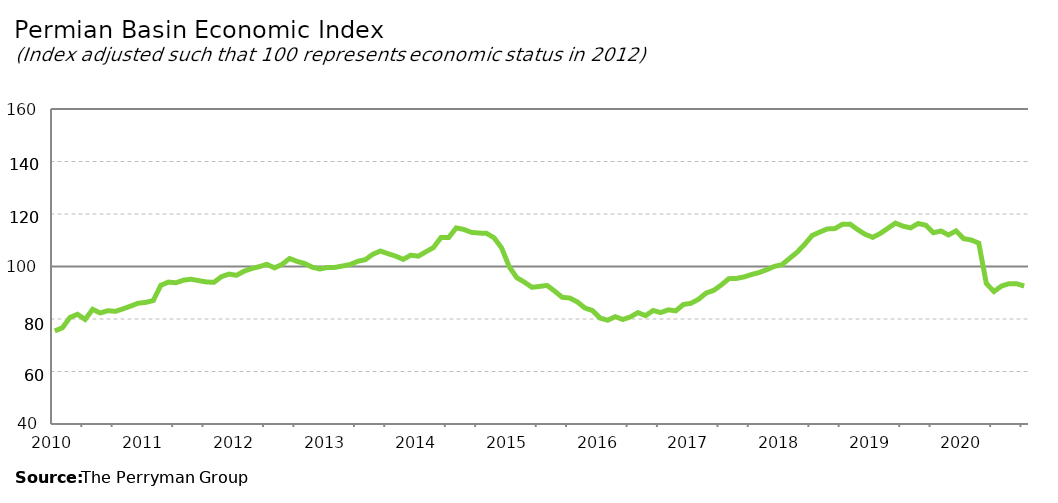
| Category | Permian Basin Composite |
|---|---|
| 2010-01-31 | 75.461 |
| 2010-02-28 | 76.62 |
| 2010-03-31 | 80.582 |
| 2010-04-30 | 81.793 |
| 2010-05-31 | 79.822 |
| 2010-06-30 | 83.686 |
| 2010-07-31 | 82.299 |
| 2010-08-31 | 83.148 |
| 2010-09-30 | 82.922 |
| 2010-10-31 | 83.863 |
| 2010-11-30 | 84.896 |
| 2010-12-31 | 86.004 |
| 2011-01-31 | 86.323 |
| 2011-02-28 | 87.023 |
| 2011-03-31 | 92.842 |
| 2011-04-30 | 94.055 |
| 2011-05-31 | 93.811 |
| 2011-06-30 | 94.786 |
| 2011-07-31 | 95.163 |
| 2011-08-31 | 94.605 |
| 2011-09-30 | 94.123 |
| 2011-10-31 | 93.96 |
| 2011-11-30 | 96.126 |
| 2011-12-31 | 97.099 |
| 2012-01-31 | 96.663 |
| 2012-02-29 | 98.203 |
| 2012-03-31 | 99.238 |
| 2012-04-30 | 99.943 |
| 2012-05-31 | 100.841 |
| 2012-06-30 | 99.476 |
| 2012-07-31 | 100.78 |
| 2012-08-31 | 103.043 |
| 2012-09-30 | 101.935 |
| 2012-10-31 | 101.136 |
| 2012-11-30 | 99.73 |
| 2012-12-31 | 99.043 |
| 2013-01-31 | 99.644 |
| 2013-02-28 | 99.666 |
| 2013-03-31 | 100.196 |
| 2013-04-30 | 100.75 |
| 2013-05-31 | 101.978 |
| 2013-06-30 | 102.585 |
| 2013-07-31 | 104.678 |
| 2013-08-31 | 105.88 |
| 2013-09-30 | 104.875 |
| 2013-10-31 | 103.969 |
| 2013-11-30 | 102.721 |
| 2013-12-31 | 104.304 |
| 2014-01-31 | 103.946 |
| 2014-02-28 | 105.602 |
| 2014-03-31 | 107.217 |
| 2014-04-30 | 111.074 |
| 2014-05-31 | 111.007 |
| 2014-06-30 | 114.697 |
| 2014-07-31 | 114.128 |
| 2014-08-31 | 113.009 |
| 2014-09-30 | 112.738 |
| 2014-10-31 | 112.638 |
| 2014-11-30 | 110.945 |
| 2014-12-31 | 107.081 |
| 2015-01-31 | 99.934 |
| 2015-02-28 | 95.74 |
| 2015-03-31 | 94.059 |
| 2015-04-30 | 92.069 |
| 2015-05-31 | 92.406 |
| 2015-06-30 | 92.767 |
| 2015-07-31 | 90.629 |
| 2015-08-31 | 88.259 |
| 2015-09-30 | 87.989 |
| 2015-10-31 | 86.502 |
| 2015-11-30 | 84.191 |
| 2015-12-31 | 83.213 |
| 2016-01-31 | 80.354 |
| 2016-02-29 | 79.541 |
| 2016-03-31 | 80.891 |
| 2016-04-30 | 79.801 |
| 2016-05-31 | 80.806 |
| 2016-06-30 | 82.421 |
| 2016-07-31 | 81.279 |
| 2016-08-31 | 83.241 |
| 2016-09-30 | 82.456 |
| 2016-10-31 | 83.491 |
| 2016-11-30 | 83.112 |
| 2016-12-31 | 85.524 |
| 2017-01-31 | 85.977 |
| 2017-02-28 | 87.51 |
| 2017-03-31 | 89.897 |
| 2017-04-30 | 90.903 |
| 2017-05-31 | 92.958 |
| 2017-06-30 | 95.368 |
| 2017-07-31 | 95.46 |
| 2017-08-31 | 96.02 |
| 2017-09-30 | 96.946 |
| 2017-10-31 | 97.702 |
| 2017-11-30 | 98.779 |
| 2017-12-31 | 100.024 |
| 2018-01-31 | 100.675 |
| 2018-02-28 | 103.049 |
| 2018-03-31 | 105.394 |
| 2018-04-30 | 108.411 |
| 2018-05-31 | 111.804 |
| 2018-06-30 | 113.115 |
| 2018-07-31 | 114.312 |
| 2018-08-31 | 114.45 |
| 2018-09-30 | 116.077 |
| 2018-10-31 | 116.143 |
| 2018-11-30 | 114.07 |
| 2018-12-31 | 112.252 |
| 2019-01-31 | 111.108 |
| 2019-02-28 | 112.593 |
| 2019-03-31 | 114.553 |
| 2019-04-30 | 116.529 |
| 2019-05-31 | 115.357 |
| 2019-06-30 | 114.712 |
| 2019-07-31 | 116.377 |
| 2019-08-31 | 115.725 |
| 2019-09-30 | 112.865 |
| 2019-10-31 | 113.521 |
| 2019-11-30 | 112.025 |
| 2019-12-31 | 113.547 |
| 2020-01-31 | 110.613 |
| 2020-02-29 | 110.101 |
| 2020-03-31 | 108.878 |
| 2020-04-30 | 93.533 |
| 2020-05-31 | 90.464 |
| 2020-06-30 | 92.545 |
| 2020-07-31 | 93.465 |
| 2020-08-31 | 93.431 |
| 2020-09-30 | 92.552 |